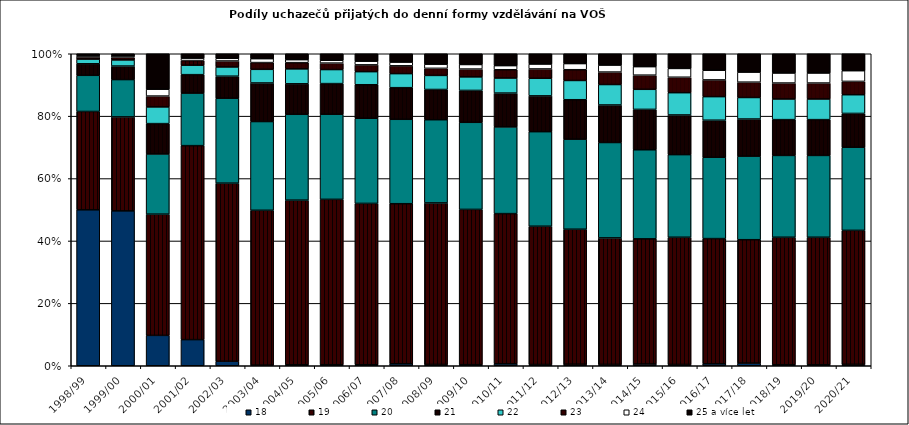
| Category | 18 | 19 | 20 | 21 | 22 | 23 | 24 | 25 a více let  |
|---|---|---|---|---|---|---|---|---|
| 1998/99 | 0.5 | 0.315 | 0.116 | 0.037 | 0.015 | 0.007 | 0.005 | 0.006 |
| 1999/00 | 0.496 | 0.301 | 0.12 | 0.043 | 0.02 | 0.008 | 0.005 | 0.007 |
| 2000/01 | 0.097 | 0.389 | 0.193 | 0.097 | 0.054 | 0.035 | 0.022 | 0.114 |
| 2001/02 | 0.084 | 0.622 | 0.168 | 0.059 | 0.03 | 0.015 | 0.008 | 0.014 |
| 2002/03 | 0.014 | 0.571 | 0.272 | 0.071 | 0.03 | 0.019 | 0.009 | 0.015 |
| 2003/04 | 0.002 | 0.496 | 0.284 | 0.124 | 0.044 | 0.022 | 0.013 | 0.016 |
| 2004/05 | 0.003 | 0.528 | 0.275 | 0.098 | 0.048 | 0.02 | 0.01 | 0.019 |
| 2005/06 | 0.003 | 0.53 | 0.273 | 0.098 | 0.045 | 0.021 | 0.009 | 0.021 |
| 2006/07 | 0.003 | 0.517 | 0.273 | 0.107 | 0.042 | 0.022 | 0.012 | 0.024 |
| 2007/08 | 0.006 | 0.513 | 0.271 | 0.101 | 0.045 | 0.025 | 0.012 | 0.027 |
| 2008/09 | 0.004 | 0.518 | 0.267 | 0.097 | 0.045 | 0.023 | 0.013 | 0.033 |
| 2009/10 | 0.003 | 0.498 | 0.279 | 0.102 | 0.043 | 0.025 | 0.015 | 0.034 |
| 2010/11 | 0.006 | 0.481 | 0.278 | 0.108 | 0.048 | 0.027 | 0.013 | 0.038 |
| 2011/12 | 0.004 | 0.443 | 0.303 | 0.115 | 0.056 | 0.03 | 0.016 | 0.033 |
| 2012/13 | 0.005 | 0.433 | 0.289 | 0.126 | 0.062 | 0.034 | 0.02 | 0.031 |
| 2013/14 | 0.004 | 0.405 | 0.306 | 0.12 | 0.065 | 0.04 | 0.022 | 0.036 |
| 2014/15 | 0.006 | 0.401 | 0.286 | 0.129 | 0.064 | 0.045 | 0.027 | 0.041 |
| 2015/16 | 0.004 | 0.408 | 0.265 | 0.127 | 0.071 | 0.05 | 0.028 | 0.047 |
| 2016/17 | 0.006 | 0.401 | 0.261 | 0.119 | 0.076 | 0.054 | 0.031 | 0.053 |
| 2017/18 | 0.008 | 0.395 | 0.268 | 0.119 | 0.069 | 0.049 | 0.032 | 0.059 |
| 2018/19 | 0.003 | 0.408 | 0.262 | 0.115 | 0.066 | 0.051 | 0.032 | 0.062 |
| 2019/20 | 0.003 | 0.408 | 0.262 | 0.115 | 0.066 | 0.051 | 0.032 | 0.062 |
| 2020/21 | 0.005 | 0.429 | 0.266 | 0.108 | 0.06 | 0.043 | 0.034 | 0.054 |